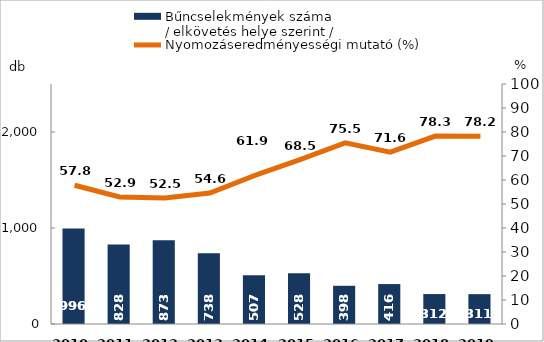
| Category | Bűncselekmények száma
/ elkövetés helye szerint / |
|---|---|
| 2010. év | 996 |
| 2011. év | 828 |
| 2012. év | 873 |
| 2013. év | 738 |
| 2014. év | 507 |
| 2015. év | 528 |
| 2016. év | 398 |
| 2017. év | 416 |
| 2018. év | 312 |
| 2019. év | 311 |